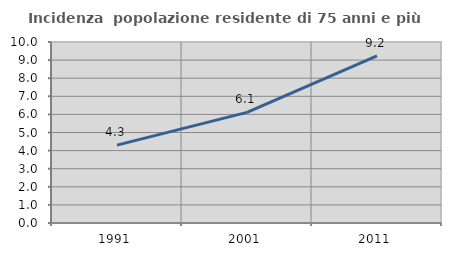
| Category | Incidenza  popolazione residente di 75 anni e più |
|---|---|
| 1991.0 | 4.304 |
| 2001.0 | 6.111 |
| 2011.0 | 9.237 |